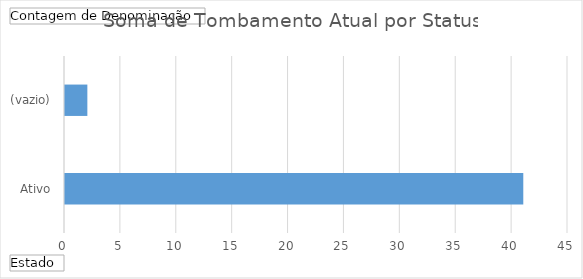
| Category | Total |
|---|---|
| Ativo | 41 |
| (vazio) | 2 |